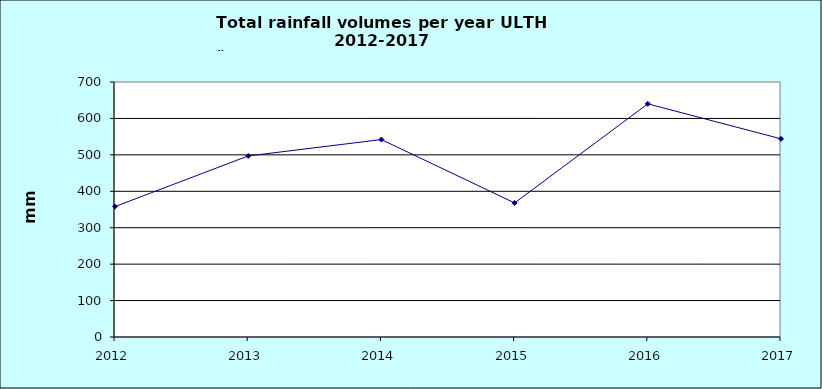
| Category | Series 0 |
|---|---|
| 2012.0 | 358 |
| 2013.0 | 497 |
| 2014.0 | 542 |
| 2015.0 | 368 |
| 2016.0 | 640 |
| 2017.0 | 544 |